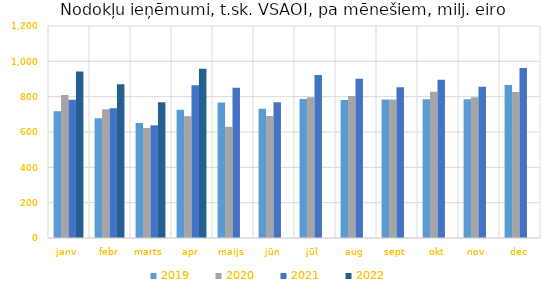
| Category | 2019 | 2020 | 2021 | 2022 |
|---|---|---|---|---|
| janv | 717665.072 | 809688.721 | 782986.001 | 941791.936 |
| febr | 677510.103 | 729172.133 | 734852.065 | 870814.989 |
| marts | 650253.135 | 622803.58 | 637891.51 | 769054.685 |
| apr | 726487.169 | 689512.187 | 864350.424 | 957835.152 |
| maijs | 766741.521 | 629295.897 | 850252.991 | 0 |
| jūn | 731242 | 690672.482 | 768738.388 | 0 |
| jūl | 786636.326 | 796698.852 | 922262.256 | 0 |
| aug | 780536.674 | 803951.557 | 901674.184 | 0 |
| sept | 784169.124 | 783355.666 | 852725.586 | 0 |
| okt | 785502.085 | 827797.907 | 895873.595 | 0 |
| nov | 784818.309 | 797101.461 | 856461.1 | 0 |
| dec | 865773.712 | 826496.37 | 962936.043 | 0 |